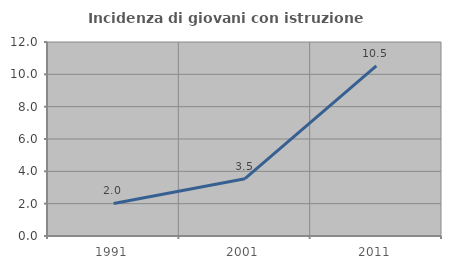
| Category | Incidenza di giovani con istruzione universitaria |
|---|---|
| 1991.0 | 2.013 |
| 2001.0 | 3.546 |
| 2011.0 | 10.526 |